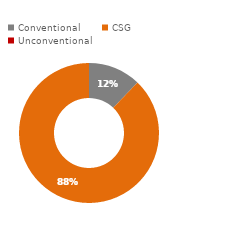
| Category | Series 0 |
|---|---|
| Conventional | 6398.245 |
| CSG | 46130.177 |
| Unconventional | 4.868 |